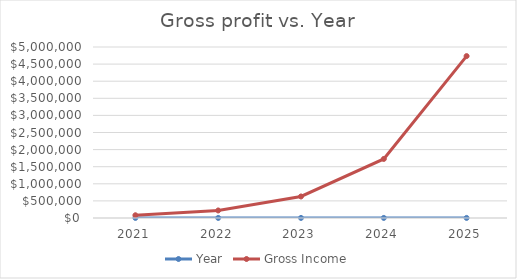
| Category | Year | Gross Income |
|---|---|---|
| 2021.0 | 2021 | 80000 |
| 2022.0 | 2022 | 220480 |
| 2023.0 | 2023 | 629216 |
| 2024.0 | 2024 | 1726973.2 |
| 2025.0 | 2025 | 4734288.6 |